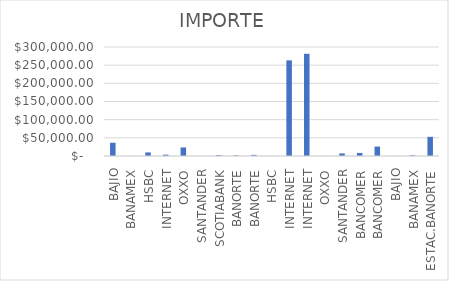
| Category | IMPORTE |
|---|---|
| BAJIO | 36473.94 |
| BANAMEX | 152.13 |
| HSBC | 9862.81 |
| INTERNET | 3684.7 |
| OXXO | 23576.15 |
| SANTANDER | 85.45 |
| SCOTIABANK | 2360.28 |
| BANORTE | 1713.5 |
| BANORTE | 2991.3 |
| HSBC | 282.24 |
| INTERNET | 263209.83 |
| INTERNET | 281233.34 |
| OXXO | 210 |
| SANTANDER | 7118.78 |
| BANCOMER | 8402.95 |
| BANCOMER | 25938.79 |
| BAJIO | 327.66 |
| BANAMEX | 1931.33 |
| ESTAC.BANORTE | 52676.4 |